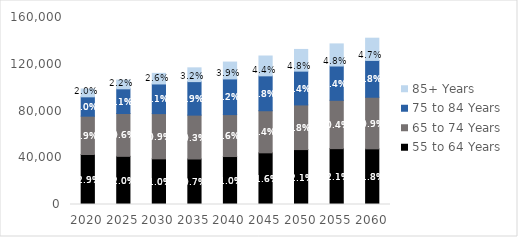
| Category | 55 to 64 Years | 65 to 74 Years | 75 to 84 Years | 85+ Years |
|---|---|---|---|---|
| 2020.0 | 42783 | 32789 | 16561 | 6701 |
| 2025.0 | 41205 | 36640 | 21137 | 7450 |
| 2030.0 | 39071 | 38686 | 25377 | 9074 |
| 2035.0 | 38937 | 37532 | 28673 | 11792 |
| 2040.0 | 41040 | 35879 | 30517 | 14429 |
| 2045.0 | 44211 | 36009 | 29872 | 16954 |
| 2050.0 | 46991 | 38204 | 28909 | 18561 |
| 2055.0 | 47795 | 41356 | 29346 | 18914 |
| 2060.0 | 47612 | 44153 | 31504 | 19020 |